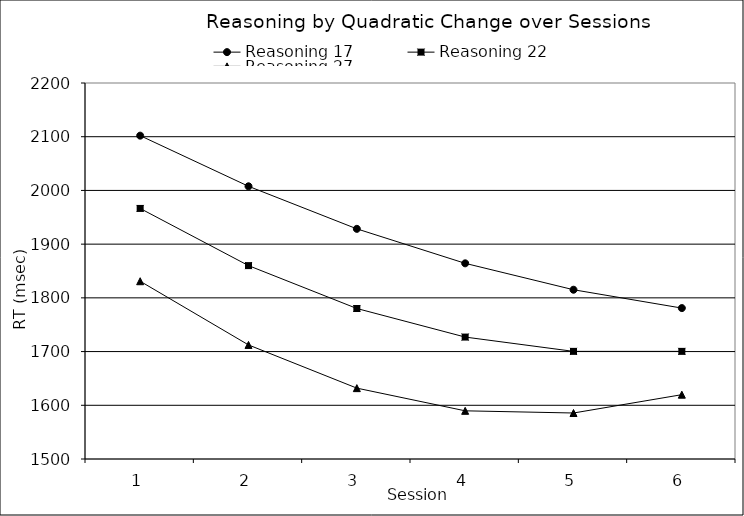
| Category | Reasoning 17 | Reasoning 22 | Reasoning 27 |
|---|---|---|---|
| 0 | 2101.972 | 1966.47 | 1830.968 |
| 1 | 2007.707 | 1860.034 | 1712.361 |
| 2 | 1928.473 | 1780.204 | 1631.935 |
| 3 | 1864.272 | 1726.982 | 1589.692 |
| 4 | 1815.104 | 1700.368 | 1585.632 |
| 5 | 1780.967 | 1700.36 | 1619.753 |